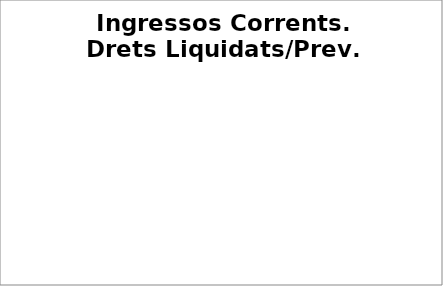
| Category | Series 0 |
|---|---|
| Impostos locals | 0.368 |
| Participació Tributs de l'Estat | 0.323 |
| Taxes i altres ingressos | 0.196 |
| Transferències corrents (exc. FCF) | 0.245 |
| Ingressos patrimonials | 0.229 |
| Ingressos corrents | 0.323 |